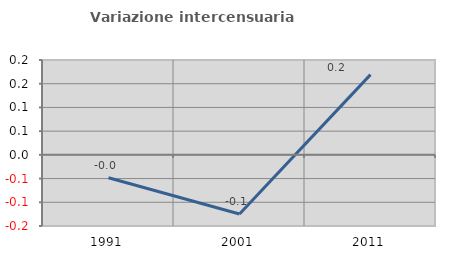
| Category | Variazione intercensuaria annua |
|---|---|
| 1991.0 | -0.048 |
| 2001.0 | -0.125 |
| 2011.0 | 0.169 |